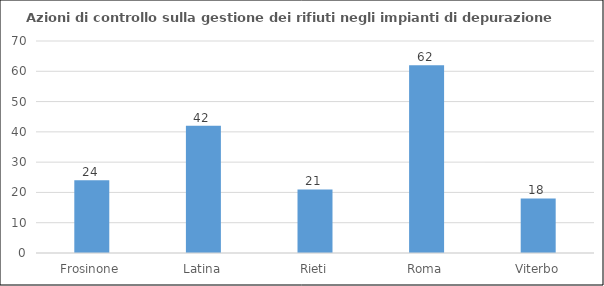
| Category | controllo matrice rifiuti sui depuratori |
|---|---|
| Frosinone | 24 |
| Latina | 42 |
| Rieti | 21 |
| Roma | 62 |
| Viterbo | 18 |